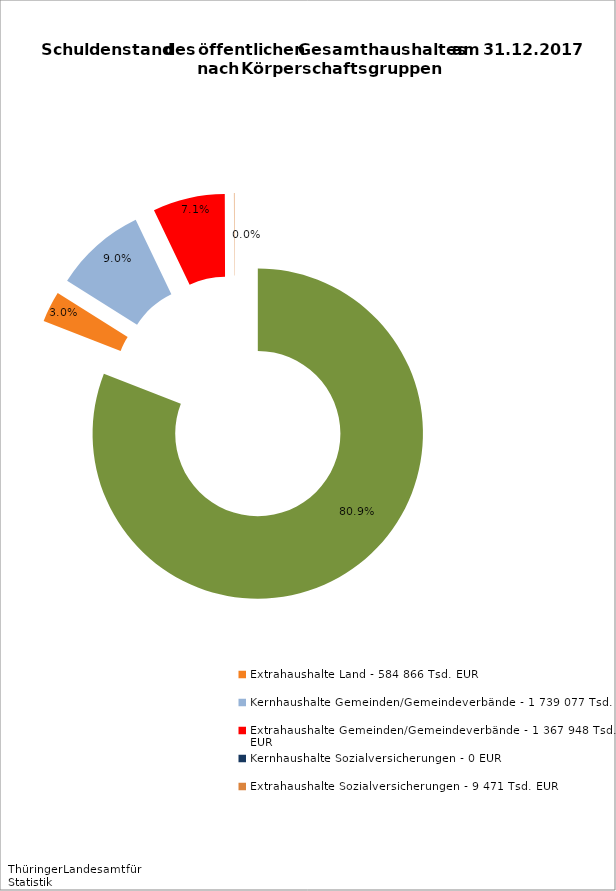
| Category | Series 0 |
|---|---|
| Kernhaushalt Land - 15 685 408 Tsd. EUR | 15685408.053 |
| Extrahaushalte Land - 584 866 Tsd. EUR | 584865.65 |
| Kernhaushalte Gemeinden/Gemeindeverbände - 1 739 077 Tsd. EUR | 1739077.355 |
| Extrahaushalte Gemeinden/Gemeindeverbände - 1 367 948 Tsd. EUR | 1367947.85 |
| Kernhaushalte Sozialversicherungen - 0 EUR | 0 |
| Extrahaushalte Sozialversicherungen - 9 471 Tsd. EUR | 9471.328 |